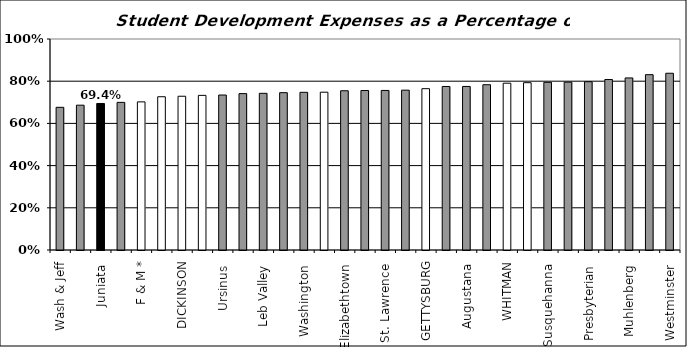
| Category | of E&G |
|---|---|
| Wash & Jeff | 0.676 |
| Millsaps  | 0.686 |
| Juniata  | 0.694 |
| C of Wooster | 0.7 |
| F & M * | 0.702 |
| SEWANEE | 0.726 |
| DICKINSON | 0.729 |
| CENTRE | 0.733 |
| Ursinus  | 0.734 |
| Wofford  | 0.741 |
| Leb Valley  | 0.743 |
| Wittenberg  | 0.746 |
| Washington  | 0.747 |
| UNION | 0.748 |
| Elizabethtown  | 0.755 |
| Knox  | 0.756 |
| St. Lawrence  | 0.756 |
| McDaniel  | 0.758 |
| GETTYSBURG | 0.765 |
| Allegheny  | 0.775 |
| Augustana  | 0.775 |
| Moravian | 0.783 |
| WHITMAN | 0.791 |
| KENYON | 0.793 |
| Susquehanna  | 0.795 |
| Drew  | 0.795 |
| Presbyterian  | 0.798 |
| Lycoming  | 0.808 |
| Muhlenberg  | 0.816 |
| Birm Southern  | 0.831 |
| Westminster  | 0.838 |